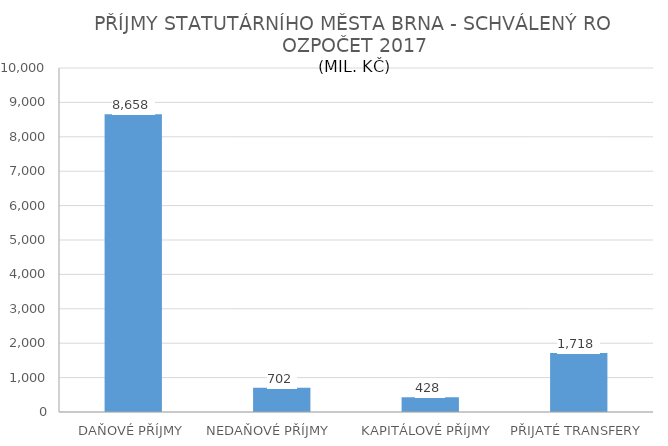
| Category | Series 0 |
|---|---|
| DAŇOVÉ PŘÍJMY | 8658.286 |
| NEDAŇOVÉ PŘÍJMY              | 701.647 |
| KAPITÁLOVÉ PŘÍJMY  | 428.105 |
| PŘIJATÉ TRANSFERY | 1717.855 |